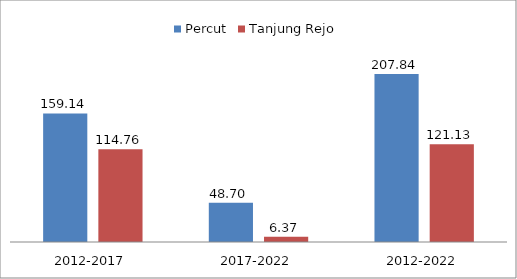
| Category | Percut | Tanjung Rejo |
|---|---|---|
| 2012-2017 | 159.14 | 114.76 |
| 2017-2022 | 48.7 | 6.37 |
| 2012-2022 | 207.84 | 121.13 |